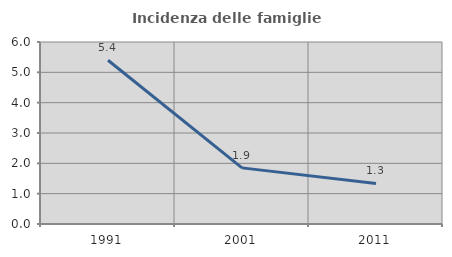
| Category | Incidenza delle famiglie numerose |
|---|---|
| 1991.0 | 5.399 |
| 2001.0 | 1.85 |
| 2011.0 | 1.337 |